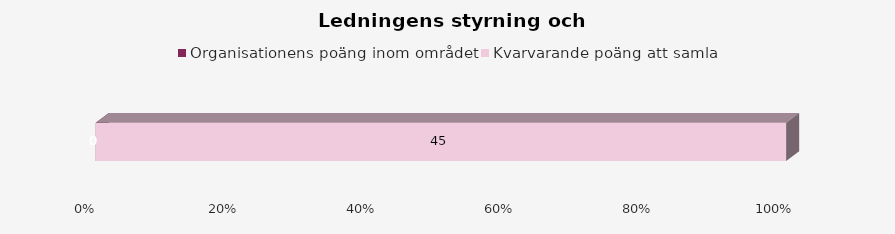
| Category | Organisationens poäng inom området | Kvarvarande poäng att samla |
|---|---|---|
| 0 | 0 | 45 |